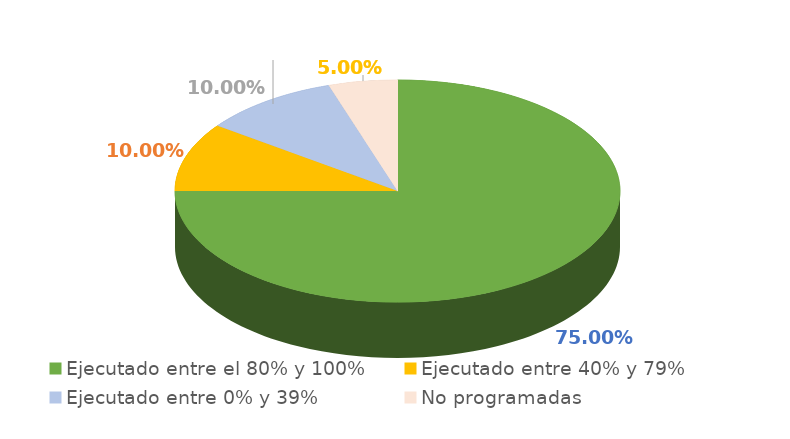
| Category | Series 0 |
|---|---|
| Ejecutado entre el 80% y 100% | 0.75 |
| Ejecutado entre 40% y 79% | 0.1 |
| Ejecutado entre 0% y 39% | 0.1 |
| No programadas | 0.05 |